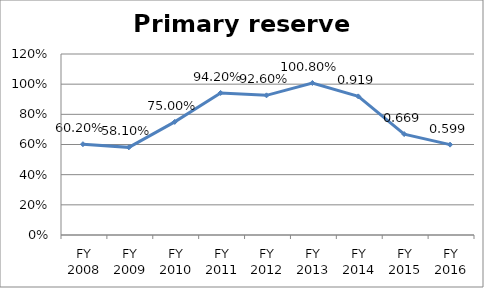
| Category | Primary reserve ratio |
|---|---|
| FY 2016 | 0.599 |
| FY 2015 | 0.669 |
| FY 2014 | 0.919 |
| FY 2013 | 1.008 |
| FY 2012 | 0.926 |
| FY 2011 | 0.942 |
| FY 2010 | 0.75 |
| FY 2009 | 0.581 |
| FY 2008 | 0.602 |